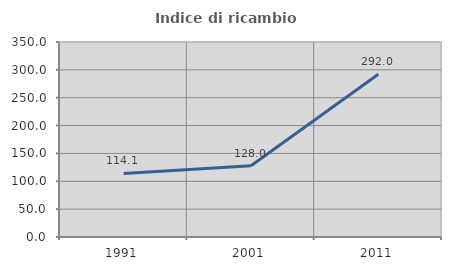
| Category | Indice di ricambio occupazionale  |
|---|---|
| 1991.0 | 114.141 |
| 2001.0 | 128.015 |
| 2011.0 | 291.98 |